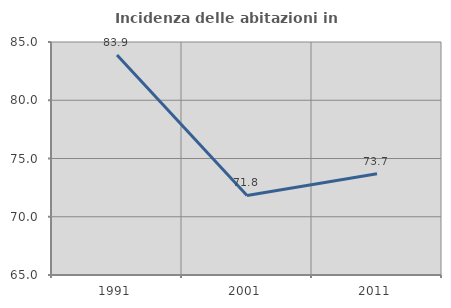
| Category | Incidenza delle abitazioni in proprietà  |
|---|---|
| 1991.0 | 83.881 |
| 2001.0 | 71.825 |
| 2011.0 | 73.7 |